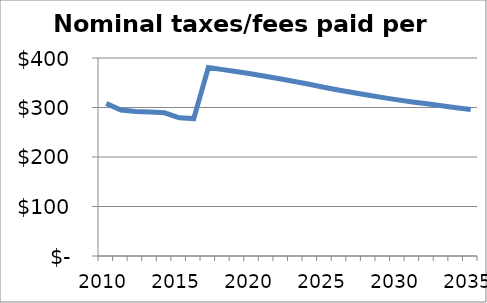
| Category | Series 0 |
|---|---|
| 2010.0 | 308.1 |
| 2011.0 | 294.968 |
| 2012.0 | 291.977 |
| 2013.0 | 290.899 |
| 2014.0 | 289.27 |
| 2015.0 | 279.117 |
| 2016.0 | 277.548 |
| 2017.0 | 380.855 |
| 2018.0 | 376.492 |
| 2019.0 | 372.13 |
| 2020.0 | 367.596 |
| 2021.0 | 362.674 |
| 2022.0 | 357.454 |
| 2023.0 | 352.036 |
| 2024.0 | 346.379 |
| 2025.0 | 340.558 |
| 2026.0 | 334.987 |
| 2027.0 | 329.71 |
| 2028.0 | 324.674 |
| 2029.0 | 319.918 |
| 2030.0 | 315.459 |
| 2031.0 | 311.276 |
| 2032.0 | 307.384 |
| 2033.0 | 303.37 |
| 2034.0 | 299.552 |
| 2035.0 | 295.928 |